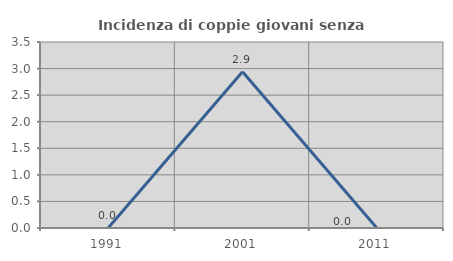
| Category | Incidenza di coppie giovani senza figli |
|---|---|
| 1991.0 | 0 |
| 2001.0 | 2.941 |
| 2011.0 | 0 |